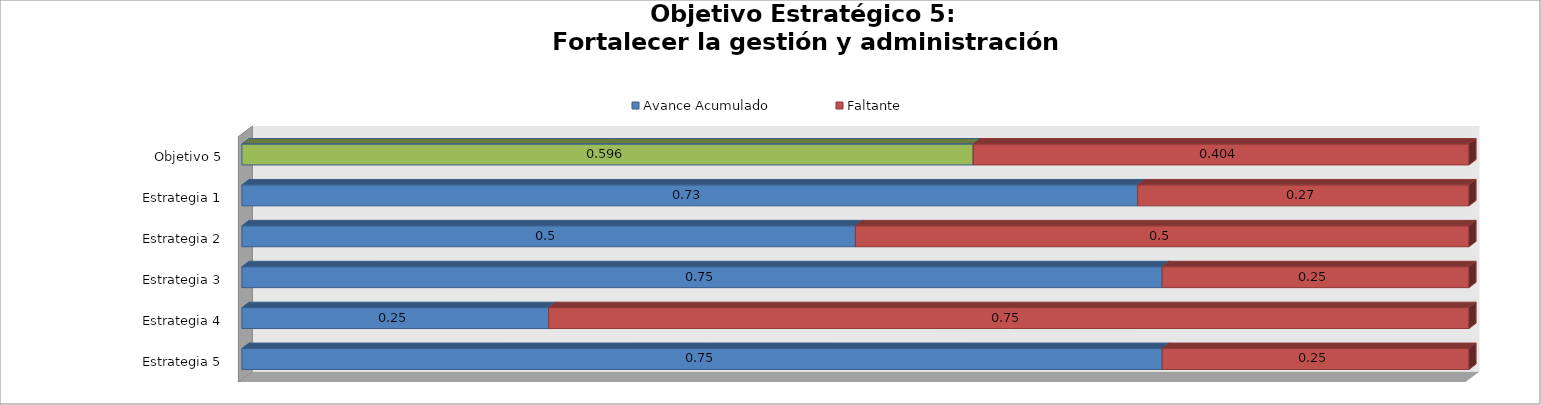
| Category | Avance Acumulado | Faltante |
|---|---|---|
| Estrategia 5 | 0.75 | 0.25 |
| Estrategia 4 | 0.25 | 0.75 |
| Estrategia 3 | 0.75 | 0.25 |
| Estrategia 2 | 0.5 | 0.5 |
| Estrategia 1 | 0.73 | 0.27 |
| Objetivo 5 | 0.596 | 0.404 |